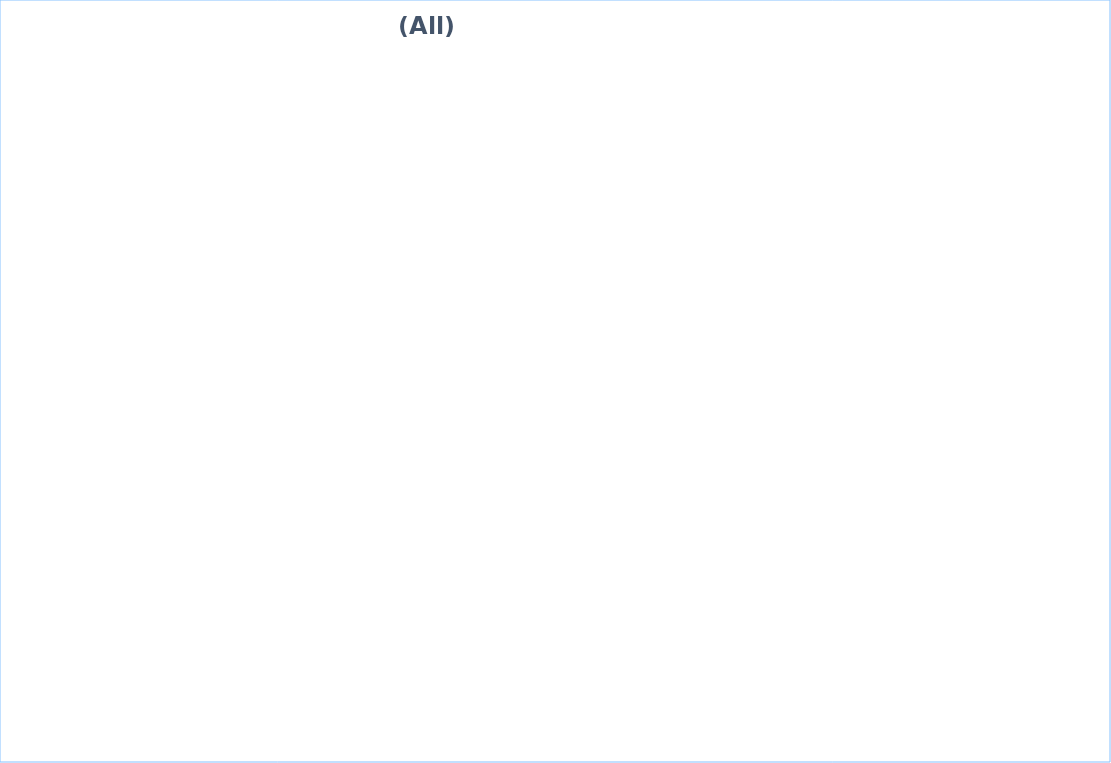
| Category | Total Population | Number of People adopt basic personal and community hygiene practices | Number of people with equitable and continuous access to safe sanitation facilities | Number of people with equitable and continuous access to sufficient quantity of domestic water |
|---|---|---|---|---|
| 0 | 2924 | 2924 | 2924 | 2924 |
| 1 | 1743 | 0 | 1743 | 581 |
| 2 | 8760 | 8760 | 8760 | 8760 |
| 3 | 68391 | 65586 | 51913 | 63572.493 |
| 4 | 276890 | 269480 | 220650 | 276662 |